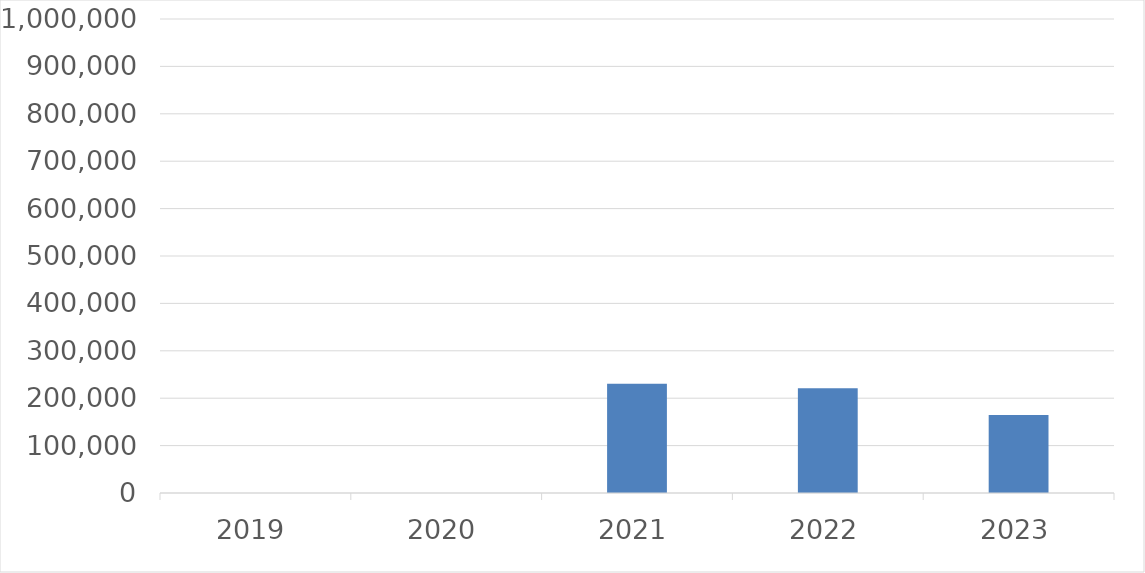
| Category | Series 0 |
|---|---|
| 2019 | 0 |
| 2020 | 0 |
| 2021 | 230580 |
| 2022 | 221012 |
| 2023 | 164700 |